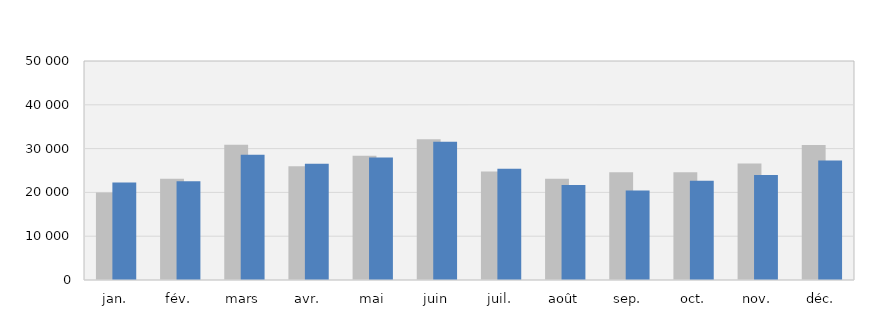
| Category | 2017 | 2018 |
|---|---|---|
| jan. | 19994 | 22258 |
| fév. | 23123 | 22536 |
| mars | 30892 | 28581 |
| avr. | 25995 | 26558 |
| mai | 28375 | 27942 |
| juin | 32141 | 31536 |
| juil. | 24798 | 25379 |
| août | 23111 | 21680 |
| sep. | 24606 | 20462 |
| oct. | 24614 | 22666 |
| nov. | 26587 | 23986 |
| déc. | 30796 | 27303 |